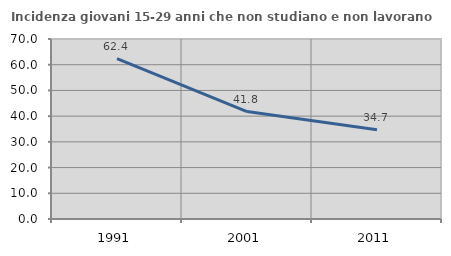
| Category | Incidenza giovani 15-29 anni che non studiano e non lavorano  |
|---|---|
| 1991.0 | 62.356 |
| 2001.0 | 41.774 |
| 2011.0 | 34.698 |